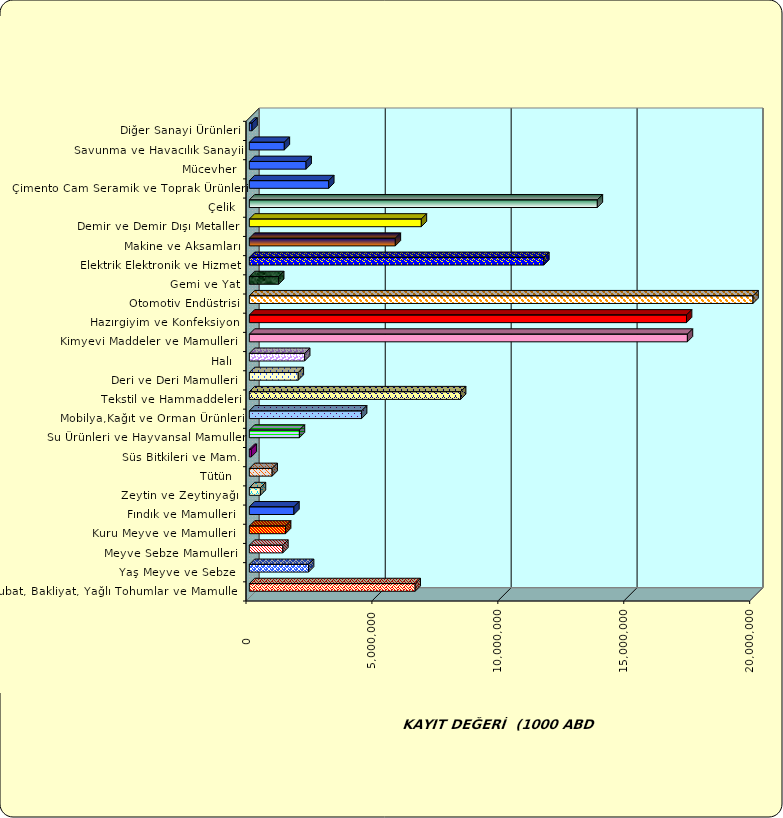
| Category | Series 0 |
|---|---|
|  Hububat, Bakliyat, Yağlı Tohumlar ve Mamulleri  | 6584570.863 |
|  Yaş Meyve ve Sebze   | 2350962.097 |
|  Meyve Sebze Mamulleri  | 1329883.858 |
|  Kuru Meyve ve Mamulleri   | 1438226.02 |
|  Fındık ve Mamulleri  | 1769624.661 |
|  Zeytin ve Zeytinyağı  | 439525.575 |
|  Tütün  | 906087.324 |
|  Süs Bitkileri ve Mam. | 76981.637 |
|  Su Ürünleri ve Hayvansal Mamuller | 1987977.762 |
|  Mobilya,Kağıt ve Orman Ürünleri | 4456532.247 |
|  Tekstil ve Hammaddeleri | 8387687.884 |
|  Deri ve Deri Mamulleri  | 1942309.427 |
|  Halı  | 2195376.093 |
|  Kimyevi Maddeler ve Mamulleri   | 17394997.915 |
|  Hazırgiyim ve Konfeksiyon  | 17359873.582 |
|  Otomotiv Endüstrisi | 21302775.334 |
|  Gemi ve Yat | 1163591.388 |
|  Elektrik Elektronik ve Hizmet | 11693493.138 |
|  Makine ve Aksamları | 5796921.57 |
|  Demir ve Demir Dışı Metaller  | 6829572.616 |
|  Çelik | 13818601.317 |
|  Çimento Cam Seramik ve Toprak Ürünleri | 3152540.927 |
|  Mücevher | 2252468.715 |
|  Savunma ve Havacılık Sanayii | 1388803.07 |
|  Diğer Sanayi Ürünleri | 104642.57 |